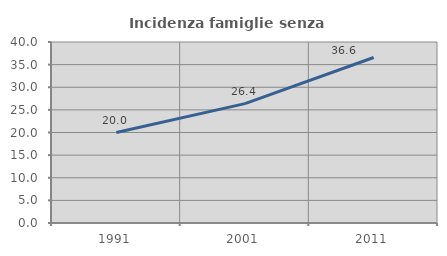
| Category | Incidenza famiglie senza nuclei |
|---|---|
| 1991.0 | 19.983 |
| 2001.0 | 26.384 |
| 2011.0 | 36.581 |